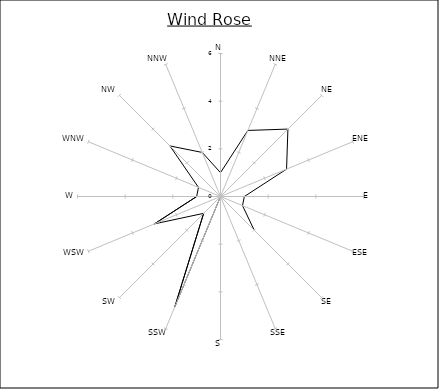
| Category | Series 0 |
|---|---|
| N | 1 |
| NNE | 3 |
| NE | 4 |
| ENE | 3 |
| E | 1 |
| ESE | 1 |
| SE | 2 |
| SSE | 0 |
| S | 0 |
| SSW | 5 |
| SW | 1 |
| WSW | 3 |
| W | 1 |
| WNW | 1 |
| NW | 3 |
| NNW | 2 |